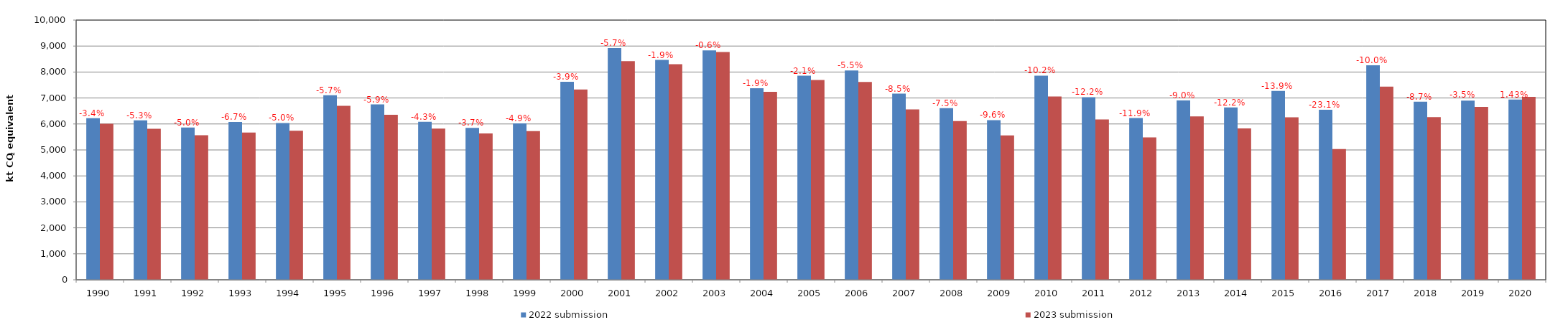
| Category | 2022 submission | 2023 submission |
|---|---|---|
| 1990.0 | 6223.568 | 6009.443 |
| 1991.0 | 6140.581 | 5813.889 |
| 1992.0 | 5864.317 | 5568.471 |
| 1993.0 | 6079.618 | 5671.875 |
| 1994.0 | 6039.21 | 5738.749 |
| 1995.0 | 7103.532 | 6702.174 |
| 1996.0 | 6752.775 | 6355.777 |
| 1997.0 | 6082.453 | 5821.925 |
| 1998.0 | 5848.638 | 5632.474 |
| 1999.0 | 6020.246 | 5724.027 |
| 2000.0 | 7626.319 | 7325.639 |
| 2001.0 | 8922.882 | 8417.843 |
| 2002.0 | 8464.067 | 8300.085 |
| 2003.0 | 8829.489 | 8773.857 |
| 2004.0 | 7375.025 | 7238.403 |
| 2005.0 | 7856.051 | 7691.013 |
| 2006.0 | 8058.562 | 7614.877 |
| 2007.0 | 7165.623 | 6559.426 |
| 2008.0 | 6607.009 | 6111.113 |
| 2009.0 | 6147.582 | 5556.757 |
| 2010.0 | 7861.372 | 7055.791 |
| 2011.0 | 7031.979 | 6176.52 |
| 2012.0 | 6227.316 | 5486.629 |
| 2013.0 | 6908.675 | 6289.666 |
| 2014.0 | 6639.48 | 5826.942 |
| 2015.0 | 7272.347 | 6259.409 |
| 2016.0 | 6549.189 | 5036.465 |
| 2017.0 | 8262.306 | 7438.86 |
| 2018.0 | 6860.437 | 6263.984 |
| 2019.0 | 6899.279 | 6657.068 |
| 2020.0 | 6943.199 | 7042.45 |